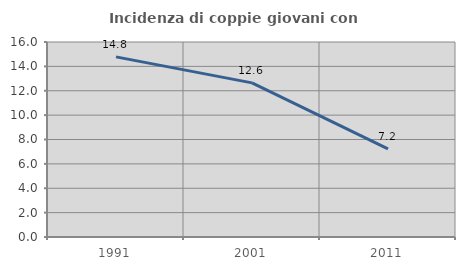
| Category | Incidenza di coppie giovani con figli |
|---|---|
| 1991.0 | 14.778 |
| 2001.0 | 12.647 |
| 2011.0 | 7.229 |